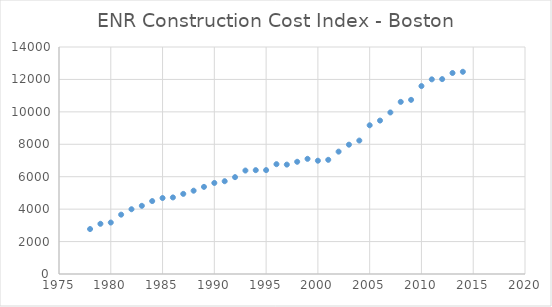
| Category | Series 0 |
|---|---|
| 2014.0 | 12471.31 |
| 2013.0 | 12396.33 |
| 2012.0 | 12019.38 |
| 2011.0 | 12005.21 |
| 2010.0 | 11590.38 |
| 2009.0 | 10740.3 |
| 2008.0 | 10615.17 |
| 2007.0 | 9963.61 |
| 2006.0 | 9462.63 |
| 2005.0 | 9172.36 |
| 2004.0 | 8229.58 |
| 2003.0 | 7976.09 |
| 2002.0 | 7546.61 |
| 2001.0 | 7042.39 |
| 2000.0 | 6986.61 |
| 1999.0 | 7103.92 |
| 1998.0 | 6921.04 |
| 1997.0 | 6747.28 |
| 1996.0 | 6772.2 |
| 1995.0 | 6407.28 |
| 1994.0 | 6404.34 |
| 1993.0 | 6380.25 |
| 1992.0 | 5973.33 |
| 1991.0 | 5722.5 |
| 1990.0 | 5614.79 |
| 1989.0 | 5373.14 |
| 1988.0 | 5137.58 |
| 1987.0 | 4941.39 |
| 1986.0 | 4722.66 |
| 1985.0 | 4685.85 |
| 1984.0 | 4497.4 |
| 1983.0 | 4204.75 |
| 1982.0 | 3993.72 |
| 1981.0 | 3659.88 |
| 1980.0 | 3173.98 |
| 1979.0 | 3096.16 |
| 1978.0 | 2772.83 |